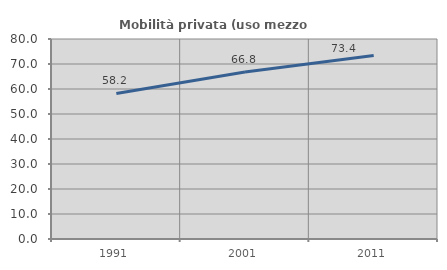
| Category | Mobilità privata (uso mezzo privato) |
|---|---|
| 1991.0 | 58.221 |
| 2001.0 | 66.809 |
| 2011.0 | 73.375 |